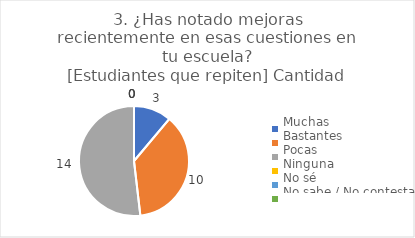
| Category | 3. ¿Has notado mejoras recientemente en esas cuestiones en tu escuela?
[Estudiantes que repiten] |
|---|---|
| Muchas  | 0.111 |
| Bastantes  | 0.37 |
| Pocas  | 0.519 |
| Ninguna  | 0 |
| No sé  | 0 |
| No sabe / No contesta | 0 |